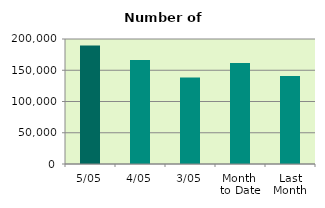
| Category | Series 0 |
|---|---|
| 5/05 | 189564 |
| 4/05 | 166338 |
| 3/05 | 138340 |
| Month 
to Date | 161539.5 |
| Last
Month | 140978.316 |